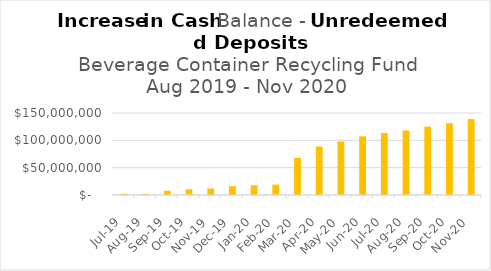
| Category | Series 3 |
|---|---|
| 2019-07-01 | 2170094.49 |
| 2019-08-01 | 1969257.14 |
| 2019-09-01 | 7811589.97 |
| 2019-10-01 | 10424190.41 |
| 2019-11-01 | 11947091.14 |
| 2019-12-01 | 16210833.38 |
| 2020-01-01 | 17721684.94 |
| 2020-02-01 | 18907125.58 |
| 2020-03-01 | 67985835.1 |
| 2020-04-01 | 88730443.19 |
| 2020-05-01 | 97859964.82 |
| 2020-06-01 | 107336138.93 |
| 2020-07-01 | 113444204.24 |
| 2020-08-01 | 118180201.22 |
| 2020-09-01 | 125073387.36 |
| 2020-10-01 | 131231399.62 |
| 2020-11-02 | 138890777.4 |